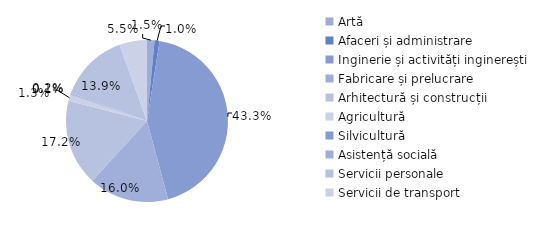
| Category | Series 0 |
|---|---|
| Artă | 1.5 |
| Afaceri și administrare | 1 |
| Inginerie și activități inginerești | 43.3 |
| Fabricare și prelucrare | 16 |
| Arhitectură și construcții | 17.2 |
| Agricultură | 1.3 |
| Silvicultură | 0.1 |
| Asistență socială | 0.2 |
| Servicii personale | 13.9 |
| Servicii de transport | 5.5 |